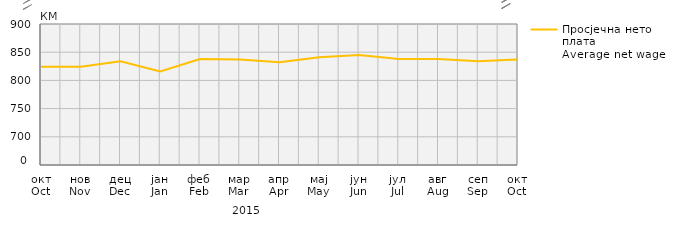
| Category | Просјечна нето плата
Average net wage |
|---|---|
| окт
Oct | 824 |
| нов
Nov | 824 |
| дец
Dec | 834 |
| јан
Jan | 816 |
| феб
Feb | 838 |
| мар
Mar | 837 |
| апр
Apr | 832 |
| мај
May | 841 |
| јун
Jun | 845 |
| јул
Jul | 838 |
| авг
Aug | 838 |
| сеп
Sep | 834 |
| окт
Oct | 837 |